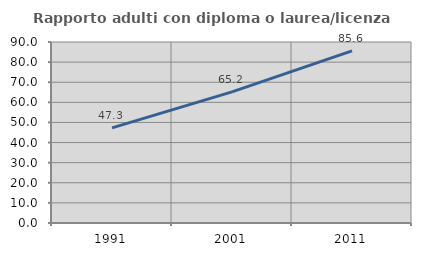
| Category | Rapporto adulti con diploma o laurea/licenza media  |
|---|---|
| 1991.0 | 47.289 |
| 2001.0 | 65.198 |
| 2011.0 | 85.599 |